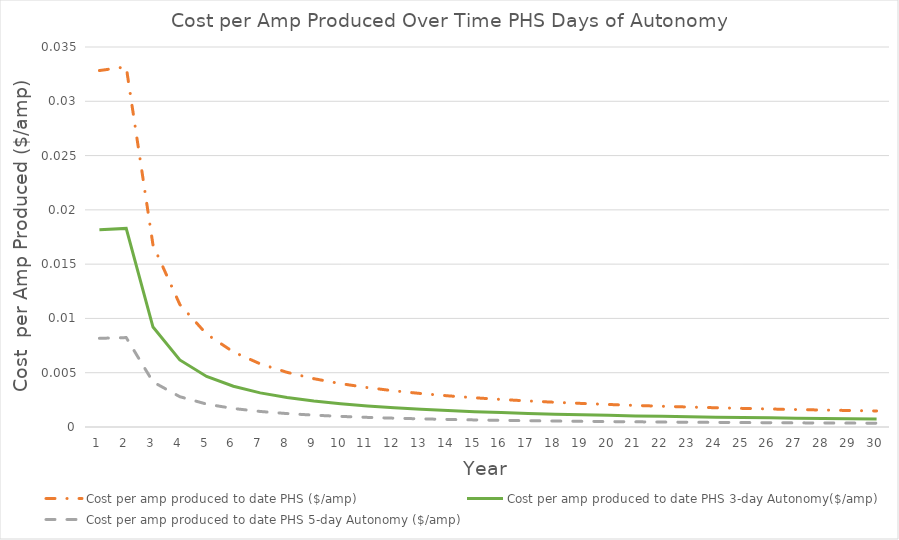
| Category | Cost per amp produced to date PHS ($/amp) | Cost per amp produced to date PHS 3-day Autonomy($/amp) | Cost per amp produced to date PHS 5-day Autonomy ($/amp) |
|---|---|---|---|
| 0 | 0.033 | 0.018 | 0.008 |
| 1 | 0.033 | 0.018 | 0.008 |
| 2 | 0.017 | 0.009 | 0.004 |
| 3 | 0.011 | 0.006 | 0.003 |
| 4 | 0.009 | 0.005 | 0.002 |
| 5 | 0.007 | 0.004 | 0.002 |
| 6 | 0.006 | 0.003 | 0.001 |
| 7 | 0.005 | 0.003 | 0.001 |
| 8 | 0.004 | 0.002 | 0.001 |
| 9 | 0.004 | 0.002 | 0.001 |
| 10 | 0.004 | 0.002 | 0.001 |
| 11 | 0.003 | 0.002 | 0.001 |
| 12 | 0.003 | 0.002 | 0.001 |
| 13 | 0.003 | 0.002 | 0.001 |
| 14 | 0.003 | 0.001 | 0.001 |
| 15 | 0.003 | 0.001 | 0.001 |
| 16 | 0.002 | 0.001 | 0.001 |
| 17 | 0.002 | 0.001 | 0.001 |
| 18 | 0.002 | 0.001 | 0.001 |
| 19 | 0.002 | 0.001 | 0 |
| 20 | 0.002 | 0.001 | 0 |
| 21 | 0.002 | 0.001 | 0 |
| 22 | 0.002 | 0.001 | 0 |
| 23 | 0.002 | 0.001 | 0 |
| 24 | 0.002 | 0.001 | 0 |
| 25 | 0.002 | 0.001 | 0 |
| 26 | 0.002 | 0.001 | 0 |
| 27 | 0.002 | 0.001 | 0 |
| 28 | 0.002 | 0.001 | 0 |
| 29 | 0.001 | 0.001 | 0 |